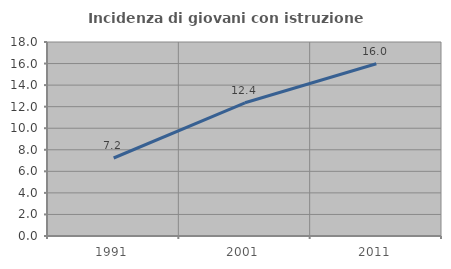
| Category | Incidenza di giovani con istruzione universitaria |
|---|---|
| 1991.0 | 7.237 |
| 2001.0 | 12.36 |
| 2011.0 | 15.982 |